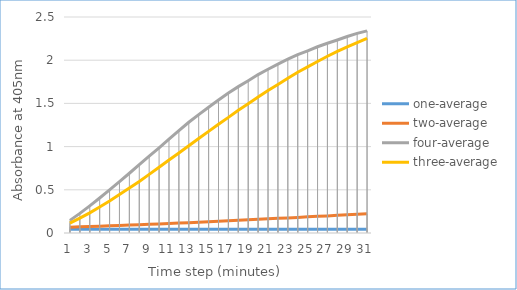
| Category | one-average | two-average | four-average | three-average |
|---|---|---|---|---|
| 0 | 0.045 | 0.068 | 0.146 | 0.113 |
| 1 | 0.044 | 0.071 | 0.227 | 0.171 |
| 2 | 0.045 | 0.075 | 0.314 | 0.234 |
| 3 | 0.044 | 0.079 | 0.405 | 0.3 |
| 4 | 0.044 | 0.083 | 0.499 | 0.371 |
| 5 | 0.044 | 0.087 | 0.594 | 0.445 |
| 6 | 0.044 | 0.092 | 0.692 | 0.52 |
| 7 | 0.044 | 0.096 | 0.792 | 0.597 |
| 8 | 0.044 | 0.1 | 0.889 | 0.679 |
| 9 | 0.044 | 0.105 | 0.986 | 0.761 |
| 10 | 0.044 | 0.11 | 1.088 | 0.844 |
| 11 | 0.044 | 0.115 | 1.185 | 0.926 |
| 12 | 0.044 | 0.12 | 1.282 | 1.009 |
| 13 | 0.044 | 0.125 | 1.371 | 1.094 |
| 14 | 0.044 | 0.131 | 1.456 | 1.177 |
| 15 | 0.044 | 0.136 | 1.539 | 1.259 |
| 16 | 0.044 | 0.141 | 1.619 | 1.338 |
| 17 | 0.044 | 0.147 | 1.694 | 1.421 |
| 18 | 0.044 | 0.152 | 1.762 | 1.495 |
| 19 | 0.044 | 0.158 | 1.833 | 1.573 |
| 20 | 0.044 | 0.164 | 1.896 | 1.65 |
| 21 | 0.044 | 0.17 | 1.955 | 1.719 |
| 22 | 0.044 | 0.175 | 2.012 | 1.791 |
| 23 | 0.044 | 0.181 | 2.063 | 1.861 |
| 24 | 0.044 | 0.187 | 2.109 | 1.922 |
| 25 | 0.044 | 0.193 | 2.156 | 1.985 |
| 26 | 0.044 | 0.198 | 2.196 | 2.046 |
| 27 | 0.044 | 0.204 | 2.234 | 2.102 |
| 28 | 0.044 | 0.21 | 2.274 | 2.155 |
| 29 | 0.044 | 0.216 | 2.31 | 2.203 |
| 30 | 0.044 | 0.222 | 2.34 | 2.253 |